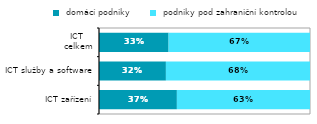
| Category |  domácí podniky |  podniky pod zahraniční kontrolou |
|---|---|---|
|   ICT zařízení | 0.369 | 0.631 |
|  ICT služby a software | 0.317 | 0.683 |
| ICT 
celkem | 0.33 | 0.67 |